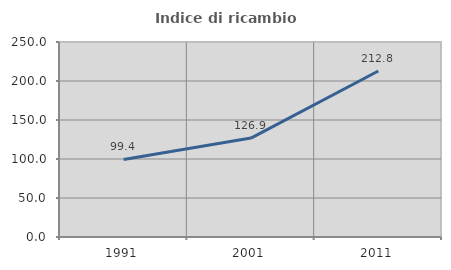
| Category | Indice di ricambio occupazionale  |
|---|---|
| 1991.0 | 99.449 |
| 2001.0 | 126.861 |
| 2011.0 | 212.8 |